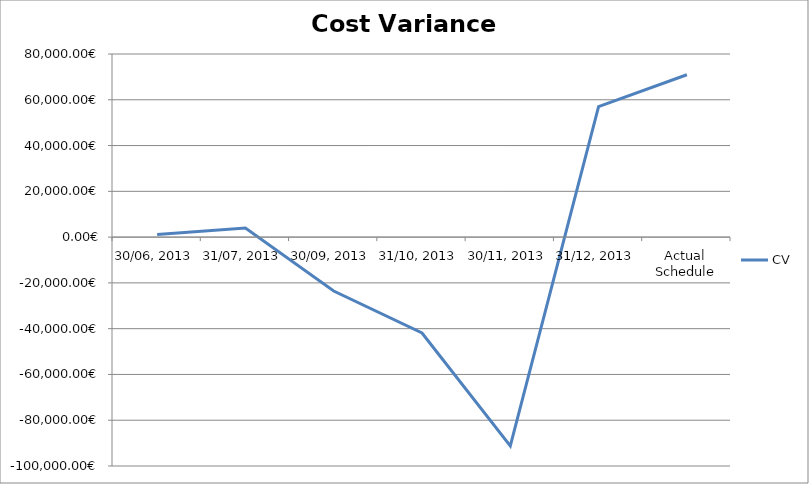
| Category | CV |
|---|---|
| 30/06, 2013 | 1170.147 |
| 31/07, 2013 | 3942.644 |
| 30/09, 2013 | -23545.354 |
| 31/10, 2013 | -41892.904 |
| 30/11, 2013 | -91180.171 |
| 31/12, 2013 | 57050.691 |
| Actual Schedule | 70931.7 |